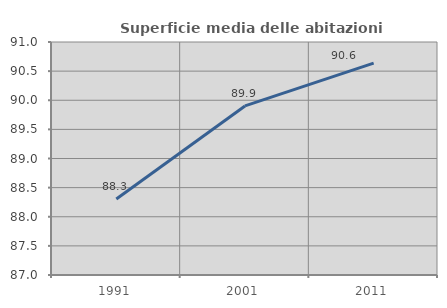
| Category | Superficie media delle abitazioni occupate |
|---|---|
| 1991.0 | 88.305 |
| 2001.0 | 89.902 |
| 2011.0 | 90.637 |